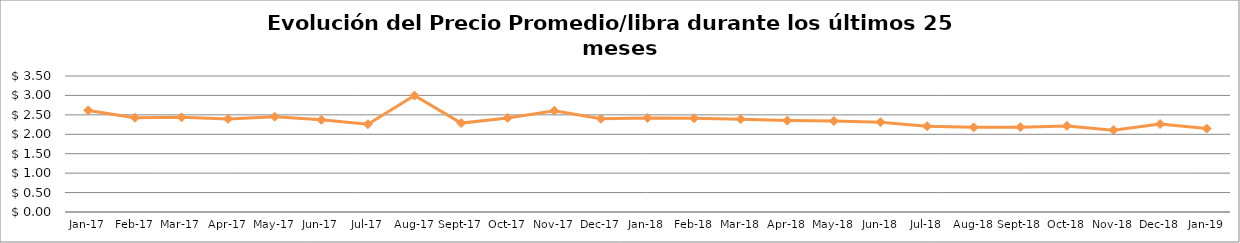
| Category | Series 0 |
|---|---|
| 2017-01-01 | 2.615 |
| 2017-02-01 | 2.424 |
| 2017-03-01 | 2.436 |
| 2017-04-01 | 2.396 |
| 2017-05-01 | 2.452 |
| 2017-06-01 | 2.372 |
| 2017-07-01 | 2.26 |
| 2017-08-01 | 2.997 |
| 2017-09-01 | 2.288 |
| 2017-10-01 | 2.421 |
| 2017-11-01 | 2.605 |
| 2017-12-01 | 2.4 |
| 2018-01-01 | 2.42 |
| 2018-02-01 | 2.412 |
| 2018-03-01 | 2.388 |
| 2018-04-01 | 2.352 |
| 2018-05-01 | 2.341 |
| 2018-06-01 | 2.312 |
| 2018-07-01 | 2.209 |
| 2018-08-01 | 2.178 |
| 2018-09-01 | 2.184 |
| 2018-10-01 | 2.216 |
| 2018-11-01 | 2.106 |
| 2018-12-01 | 2.264 |
| 2019-01-01 | 2.147 |